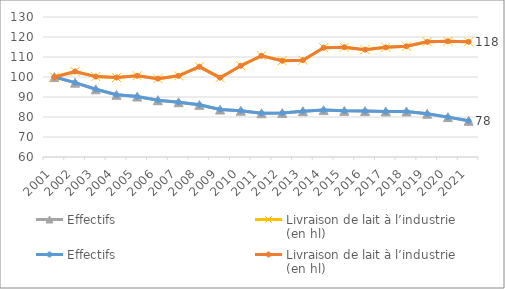
| Category | Effectifs | Livraison de lait à l’industrie
(en hl) |
|---|---|---|
| 2001 | 100 | 100 |
| 2002 | 97.178 | 102.773 |
| 2003 | 93.852 | 100.204 |
| 2004 | 91.119 | 99.732 |
| 2005 | 90.236 | 100.618 |
| 2006 | 88.399 | 99.17 |
| 2007 | 87.384 | 100.59 |
| 2008 | 86.077 | 105.132 |
| 2009 | 83.733 | 99.656 |
| 2010 | 83.16 | 105.614 |
| 2011 | 81.897 | 110.636 |
| 2012 | 81.995 | 108.106 |
| 2013 | 82.914 | 108.419 |
| 2014 | 83.438 | 114.658 |
| 2015 | 83.082 | 114.869 |
| 2016 | 82.976 | 113.683 |
| 2017 | 82.8 | 114.816 |
| 2018 | 82.784 | 115.366 |
| 2019 | 81.621 | 117.566 |
| 2020 | 79.931 | 117.888 |
| 2021 | 78.113 | 117.612 |